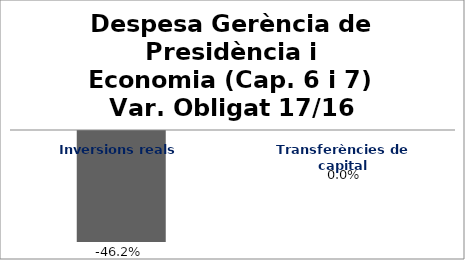
| Category | Series 0 |
|---|---|
| Inversions reals | -0.462 |
| Transferències de capital | 0 |